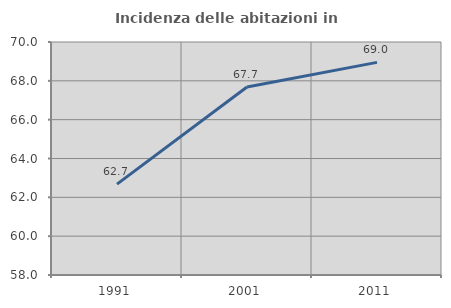
| Category | Incidenza delle abitazioni in proprietà  |
|---|---|
| 1991.0 | 62.68 |
| 2001.0 | 67.684 |
| 2011.0 | 68.951 |